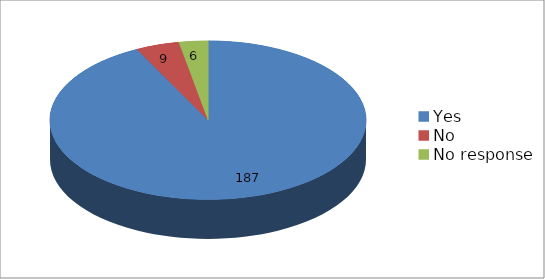
| Category | Series 0 |
|---|---|
| Yes | 187 |
| No | 9 |
| No response | 6 |